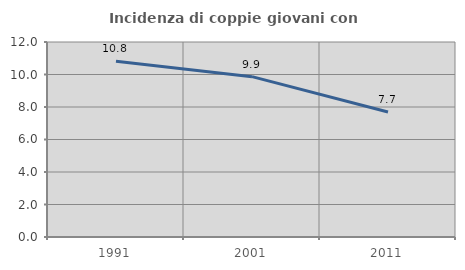
| Category | Incidenza di coppie giovani con figli |
|---|---|
| 1991.0 | 10.811 |
| 2001.0 | 9.868 |
| 2011.0 | 7.692 |